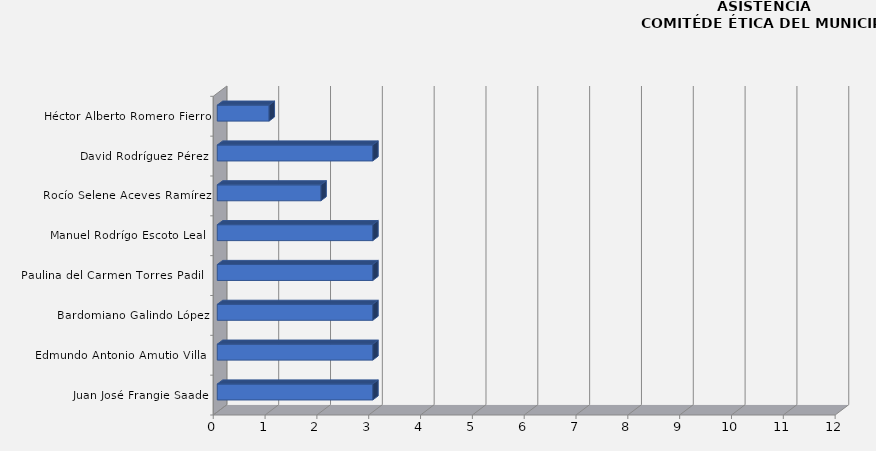
| Category | Juan José Frangie Saade |
|---|---|
| Juan José Frangie Saade | 3 |
| Edmundo Antonio Amutio Villa  | 3 |
| Bardomiano Galindo López | 3 |
| Paulina del Carmen Torres Padilla | 3 |
| Manuel Rodrígo Escoto Leal  | 3 |
| Rocío Selene Aceves Ramírez | 2 |
| David Rodríguez Pérez | 3 |
| Héctor Alberto Romero Fierro | 1 |